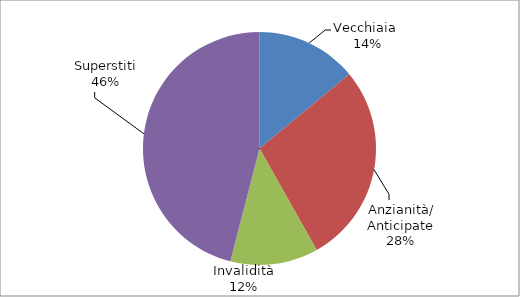
| Category | Series 0 |
|---|---|
| Vecchiaia  | 25227 |
| Anzianità/ Anticipate | 50148 |
| Invalidità | 21993 |
| Superstiti | 82853 |